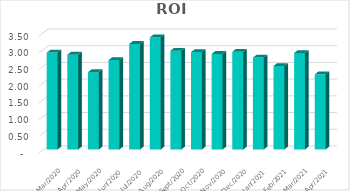
| Category |  ROI  |
|---|---|
| 2021-04-30 | 2.247 |
| 2021-03-31 | 2.885 |
| 2021-02-28 | 2.497 |
| 2021-01-31 | 2.747 |
| 2020-12-31 | 2.923 |
| 2020-11-30 | 2.858 |
| 2020-10-31 | 2.911 |
| 2020-09-30 | 2.954 |
| 2020-08-31 | 3.352 |
| 2020-07-31 | 3.156 |
| 2020-06-30 | 2.673 |
| 2020-05-31 | 2.311 |
| 2020-04-30 | 2.835 |
| 2020-03-31 | 2.896 |